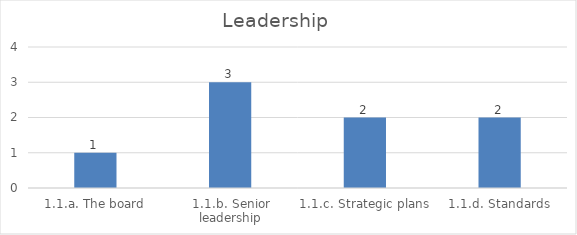
| Category | Leadership |
|---|---|
| 1.1.a. The board | 1 |
| 1.1.b. Senior leadership | 3 |
| 1.1.c. Strategic plans | 2 |
| 1.1.d. Standards | 2 |